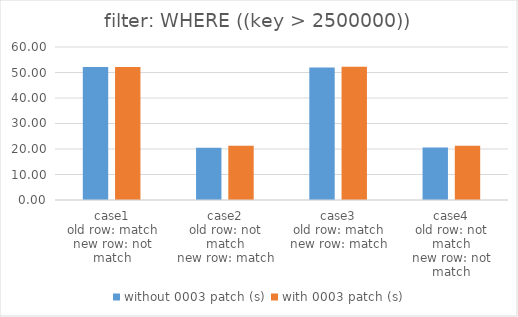
| Category | without 0003 patch (s) | with 0003 patch (s) |
|---|---|---|
| case1
old row: match
new row: not match | 52.146 | 52.178 |
| case2
old row: not match
new row: match | 20.513 | 21.232 |
| case3
old row: match
new row: match | 51.964 | 52.292 |
| case4
old row: not match
new row: not match | 20.581 | 21.296 |